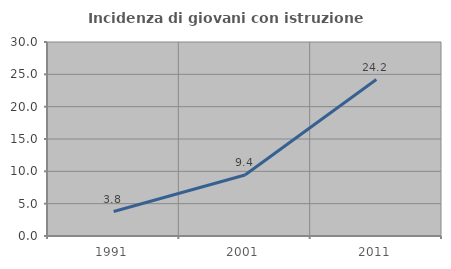
| Category | Incidenza di giovani con istruzione universitaria |
|---|---|
| 1991.0 | 3.778 |
| 2001.0 | 9.425 |
| 2011.0 | 24.194 |